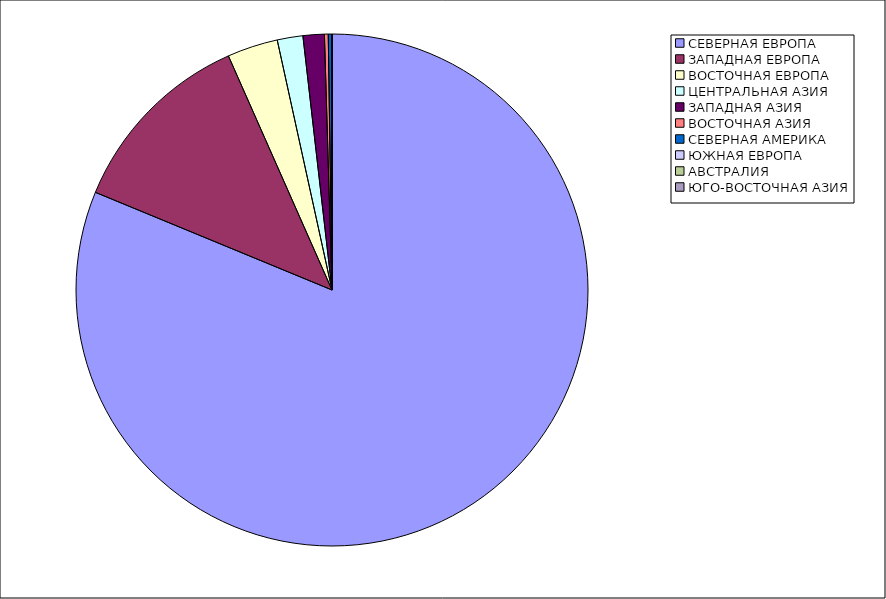
| Category | Оборот |
|---|---|
| СЕВЕРНАЯ ЕВРОПА | 81.23 |
| ЗАПАДНАЯ ЕВРОПА | 12.139 |
| ВОСТОЧНАЯ ЕВРОПА | 3.197 |
| ЦЕНТРАЛЬНАЯ АЗИЯ | 1.619 |
| ЗАПАДНАЯ АЗИЯ | 1.343 |
| ВОСТОЧНАЯ АЗИЯ | 0.239 |
| СЕВЕРНАЯ АМЕРИКА | 0.212 |
| ЮЖНАЯ ЕВРОПА | 0.015 |
| АВСТРАЛИЯ | 0.006 |
| ЮГО-ВОСТОЧНАЯ АЗИЯ | 0 |